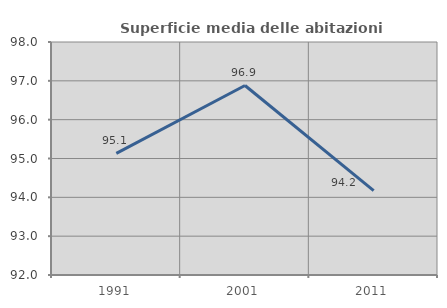
| Category | Superficie media delle abitazioni occupate |
|---|---|
| 1991.0 | 95.133 |
| 2001.0 | 96.881 |
| 2011.0 | 94.173 |